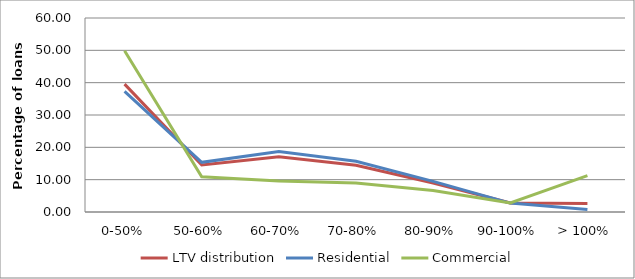
| Category | LTV distribution | Residential | Commercial |
|---|---|---|---|
| 0-50% | 39.544 | 37.278 | 49.867 |
| 50-60% | 14.562 | 15.37 | 10.88 |
| 60-70% | 17.053 | 18.687 | 9.611 |
| 70-80% | 14.47 | 15.682 | 8.948 |
| 80-90% | 8.968 | 9.485 | 6.616 |
| 90-100% | 2.769 | 2.757 | 2.828 |
| > 100% | 2.634 | 0.741 | 11.251 |